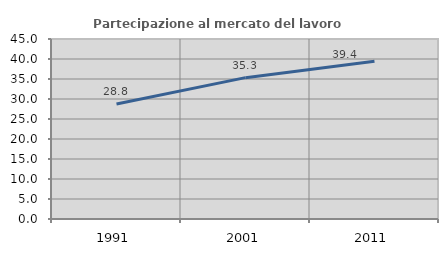
| Category | Partecipazione al mercato del lavoro  femminile |
|---|---|
| 1991.0 | 28.755 |
| 2001.0 | 35.338 |
| 2011.0 | 39.441 |